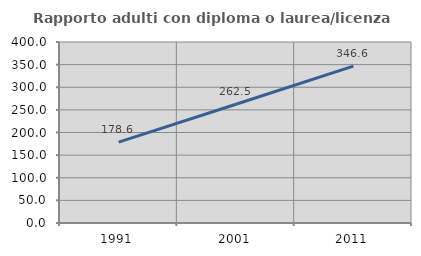
| Category | Rapporto adulti con diploma o laurea/licenza media  |
|---|---|
| 1991.0 | 178.619 |
| 2001.0 | 262.504 |
| 2011.0 | 346.581 |